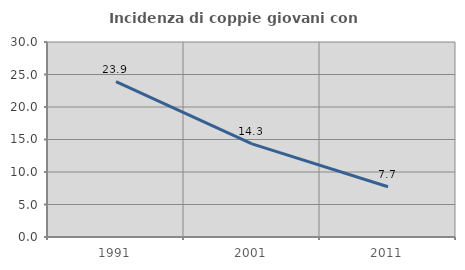
| Category | Incidenza di coppie giovani con figli |
|---|---|
| 1991.0 | 23.91 |
| 2001.0 | 14.332 |
| 2011.0 | 7.729 |